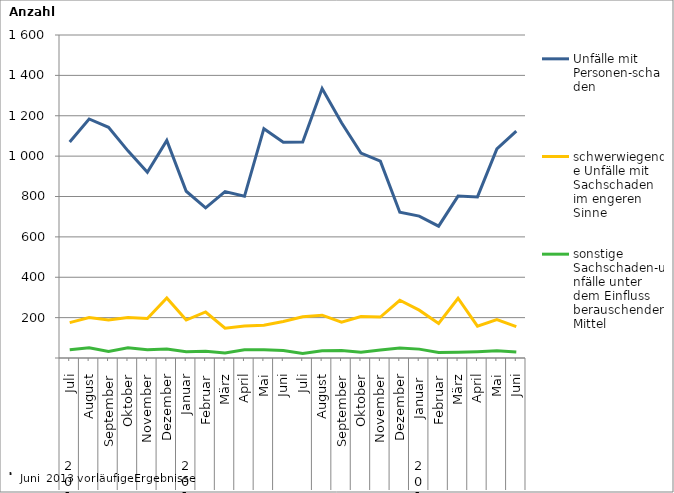
| Category | Unfälle mit Personen-schaden | schwerwiegende Unfälle mit Sachschaden   im engeren Sinne | sonstige Sachschaden-unfälle unter dem Einfluss berauschender Mittel |
|---|---|---|---|
| 0 | 1070 | 175 | 41 |
| 1 | 1184 | 200 | 51 |
| 2 | 1143 | 188 | 32 |
| 3 | 1026 | 200 | 51 |
| 4 | 920 | 196 | 41 |
| 5 | 1078 | 297 | 45 |
| 6 | 826 | 188 | 31 |
| 7 | 744 | 228 | 34 |
| 8 | 824 | 148 | 25 |
| 9 | 801 | 159 | 41 |
| 10 | 1136 | 162 | 41 |
| 11 | 1069 | 181 | 37 |
| 12 | 1070 | 204 | 22 |
| 13 | 1335 | 212 | 36 |
| 14 | 1165 | 177 | 37 |
| 15 | 1015 | 205 | 28 |
| 16 | 975 | 203 | 40 |
| 17 | 722 | 286 | 50 |
| 18 | 703 | 237 | 44 |
| 19 | 653 | 171 | 27 |
| 20 | 802 | 296 | 28 |
| 21 | 798 | 158 | 31 |
| 22 | 1036 | 190 | 36 |
| 23 | 1124 | 155 | 30 |